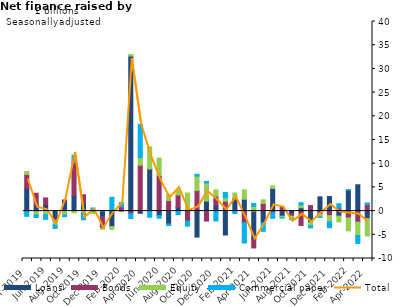
| Category | Loans | Bonds | Equity | Commercial paper |
|---|---|---|---|---|
| Apr-2019 | 4.811 | 2.92 | 0.637 | -1.109 |
| May-2019 | 1.147 | 2.622 | -0.792 | -0.561 |
| Jun-2019 | 1.346 | 1.437 | -0.744 | -1.001 |
| Jul-2019 | -1.708 | -0.281 | -0.924 | -0.742 |
| Aug-2019 | 2.185 | 0.174 | -0.812 | -0.357 |
| Sep-2019 | 3.27 | 6.981 | -0.366 | 1.548 |
| Oct-2019 | 1.798 | 1.651 | -0.408 | -1.416 |
| Nov-2019 | -0.033 | -0.195 | -0.297 | 0.654 |
| Dec-2019 | -1.155 | -2.415 | -0.255 | 0.031 |
| Jan-2020 | -3.261 | 0.155 | -0.568 | 2.731 |
| Feb-2020 | 0.166 | 0.764 | 0.028 | 0.826 |
| Mar-2020 | 32.71 | -0.54 | 0.338 | -1.041 |
| Apr-2020 | -0.467 | 9.698 | 1.608 | 7.014 |
| May-2020 | 8.786 | 0.131 | 4.646 | -1.303 |
| Jun-2020 | -0.946 | 7.494 | 3.685 | -0.564 |
| Jul-2020 | -2.71 | 2.212 | 1.257 | -0.34 |
| Aug-2020 | 0.791 | 2.614 | 0.961 | -0.762 |
| Sep-2020 | 0.207 | -2.122 | 3.614 | -1.058 |
| Oct-2020 | -5.484 | 4.349 | 3.046 | 0.366 |
| Nov-2020 | 2.118 | -2.106 | 3.81 | 0.327 |
| Dec-2020 | 1.132 | 2.015 | 1.321 | -2.076 |
| Jan-2021 | -5.045 | 2.081 | 0.746 | 1.11 |
| Feb-2021 | 2.494 | 0.193 | 1.144 | -0.517 |
| Mar-2021 | 2.491 | -2.452 | 1.989 | -4.272 |
| Apr-2021 | -6.02 | -1.754 | 0.975 | 0.65 |
| May-2021 | -2.453 | 1.596 | 0.787 | -1.817 |
| Jun-2021 | 4.772 | -0.338 | 0.532 | -1.166 |
| Jul-2021 | -1.081 | 0.867 | -0.317 | -0.072 |
| Aug-2021 | -0.588 | -0.499 | -0.568 | -0.136 |
| Sep-2021 | 0.707 | -3.026 | 0.587 | 0.481 |
| Oct-2021 | -2.369 | 1.158 | -0.732 | -0.446 |
| Nov-2021 | 3.001 | -0.729 | -0.491 | -0.107 |
| Dec-2021 | 3.07 | -0.957 | -1.296 | -1.25 |
| Jan-2022 | -1.052 | 0.598 | -1.232 | 0.961 |
| Feb-2022 | 4.431 | -1.431 | -2.726 | 0.058 |
| Mar-2022 | 5.559 | -2.323 | -2.835 | -1.663 |
| Apr-2022 | -1.58 | 1.362 | -3.653 | 0.359 |